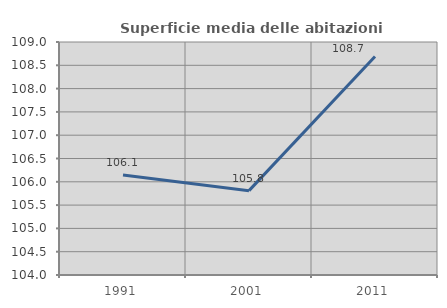
| Category | Superficie media delle abitazioni occupate |
|---|---|
| 1991.0 | 106.147 |
| 2001.0 | 105.81 |
| 2011.0 | 108.687 |